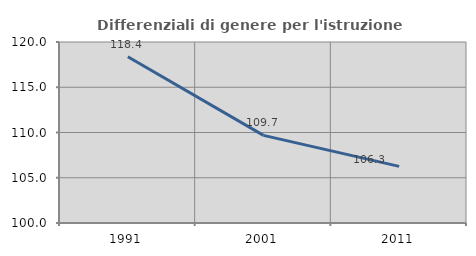
| Category | Differenziali di genere per l'istruzione superiore |
|---|---|
| 1991.0 | 118.376 |
| 2001.0 | 109.681 |
| 2011.0 | 106.256 |